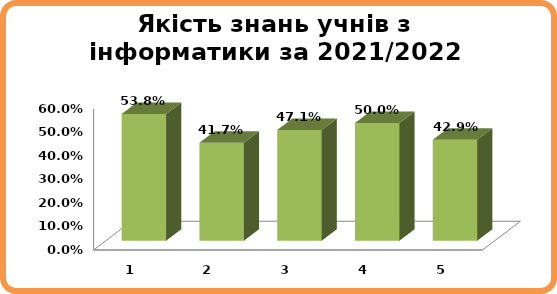
| Category | Series 0 |
|---|---|
| 0 | 0.538 |
| 1 | 0.417 |
| 2 | 0.471 |
| 3 | 0.5 |
| 4 | 0.429 |